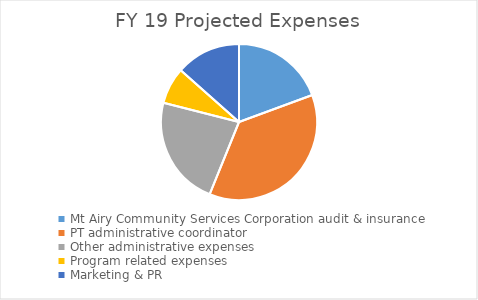
| Category | Series 0 |
|---|---|
| Mt Airy Community Services Corporation audit & insurance | 5274 |
| PT administrative coordinator | 10000 |
| Other administrative expenses | 6210 |
| Program related expenses | 2065 |
| Marketing & PR | 3660 |